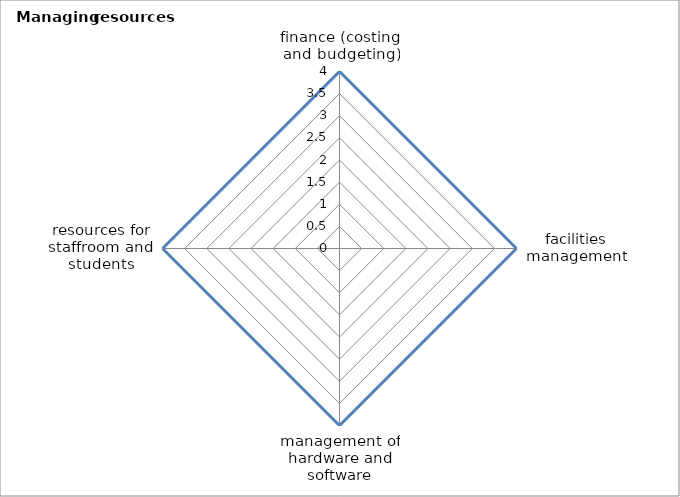
| Category | Series 0 | Series 1 |
|---|---|---|
| finance (costing and budgeting) | 4 |  |
| facilities management | 4 |  |
| management of hardware and software | 4 |  |
| resources for staffroom and students | 4 |  |